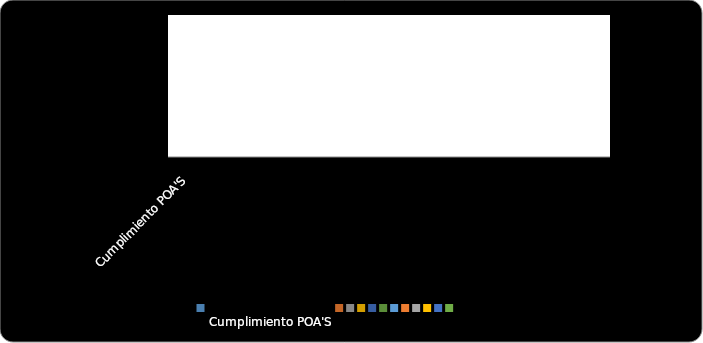
| Category | % Cumplimiento  |
|---|---|
| 
Cumplimiento POA'S | 0 |